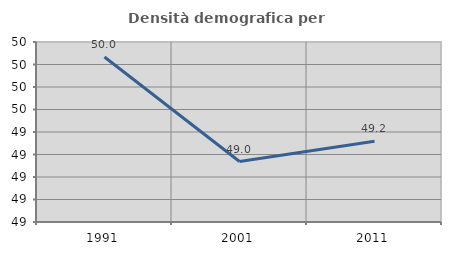
| Category | Densità demografica |
|---|---|
| 1991.0 | 49.966 |
| 2001.0 | 49.038 |
| 2011.0 | 49.219 |